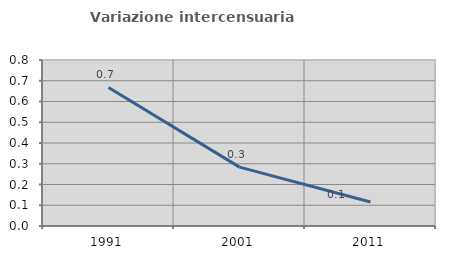
| Category | Variazione intercensuaria annua |
|---|---|
| 1991.0 | 0.668 |
| 2001.0 | 0.284 |
| 2011.0 | 0.116 |